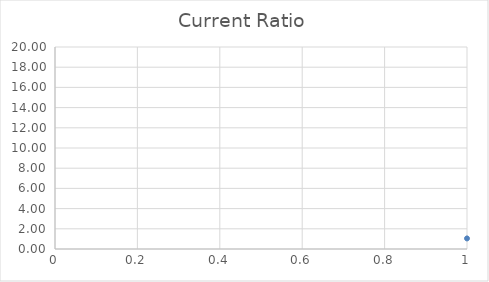
| Category | Series 0 |
|---|---|
| 0 | 1.047 |
| 1 | 1.135 |
| 2 | 1.158 |
| 3 | 1.388 |
| 4 | 1.403 |
| 5 | 1.524 |
| 6 | 1.619 |
| 7 | 1.62 |
| 8 | 1.755 |
| 9 | 1.755 |
| 10 | 1.76 |
| 11 | 1.781 |
| 12 | 1.979 |
| 13 | 2.018 |
| 14 | 2.022 |
| 15 | 2.091 |
| 16 | 2.108 |
| 17 | 2.275 |
| 18 | 2.306 |
| 19 | 2.445 |
| 20 | 2.473 |
| 21 | 2.475 |
| 22 | 2.479 |
| 23 | 2.499 |
| 24 | 2.6 |
| 25 | 2.665 |
| 26 | 2.679 |
| 27 | 2.692 |
| 28 | 2.7 |
| 29 | 2.721 |
| 30 | 2.779 |
| 31 | 2.818 |
| 32 | 2.912 |
| 33 | 3.007 |
| 34 | 3.245 |
| 35 | 3.417 |
| 36 | 3.719 |
| 37 | 3.749 |
| 38 | 3.951 |
| 39 | 4.138 |
| 40 | 4.169 |
| 41 | 4.2 |
| 42 | 4.63 |
| 43 | 4.661 |
| 44 | 4.886 |
| 45 | 5.259 |
| 46 | 5.806 |
| 47 | 6.781 |
| 48 | 7.81 |
| 49 | 17.922 |